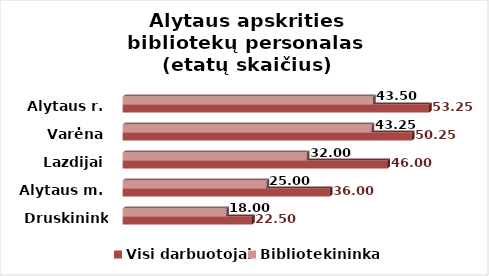
| Category | Visi darbuotojai | Bibliotekininkai |
|---|---|---|
| Druskininkai | 22.5 | 18 |
| Alytaus m. | 36 | 25 |
| Lazdijai | 46 | 32 |
| Varėna | 50.25 | 43.25 |
| Alytaus r. | 53.25 | 43.5 |